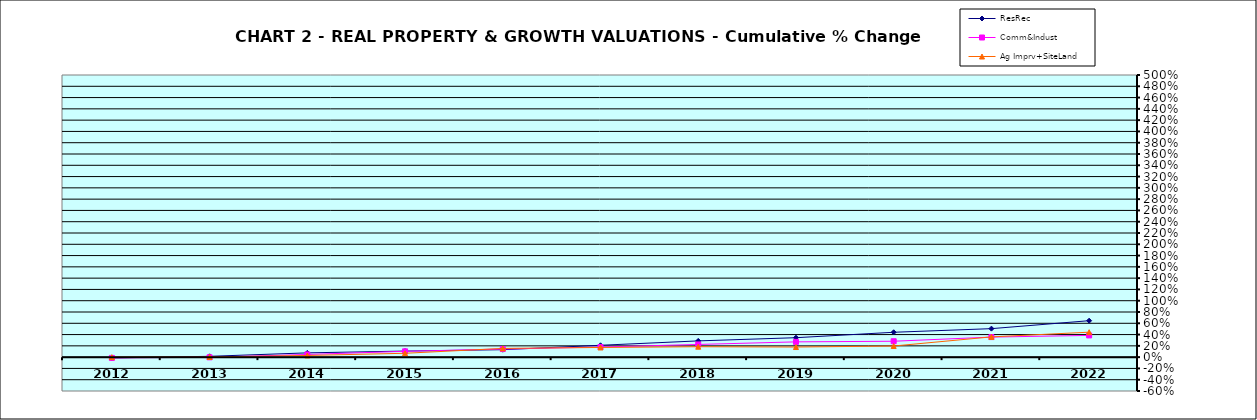
| Category | ResRec | Comm&Indust | Ag Imprv+SiteLand |
|---|---|---|---|
| 2012.0 | -0.013 | -0.013 | 0 |
| 2013.0 | 0.014 | -0.003 | 0.003 |
| 2014.0 | 0.076 | 0.048 | 0.03 |
| 2015.0 | 0.108 | 0.103 | 0.069 |
| 2016.0 | 0.132 | 0.144 | 0.155 |
| 2017.0 | 0.21 | 0.179 | 0.172 |
| 2018.0 | 0.288 | 0.225 | 0.185 |
| 2019.0 | 0.345 | 0.271 | 0.179 |
| 2020.0 | 0.441 | 0.282 | 0.197 |
| 2021.0 | 0.505 | 0.355 | 0.359 |
| 2022.0 | 0.646 | 0.385 | 0.442 |